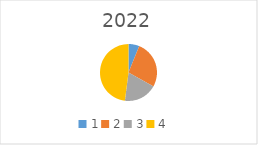
| Category | Series 0 |
|---|---|
| 1.0 | 28000 |
| 2.0 | 123000 |
| 3.0 | 86250 |
| 4.0 | 218800 |